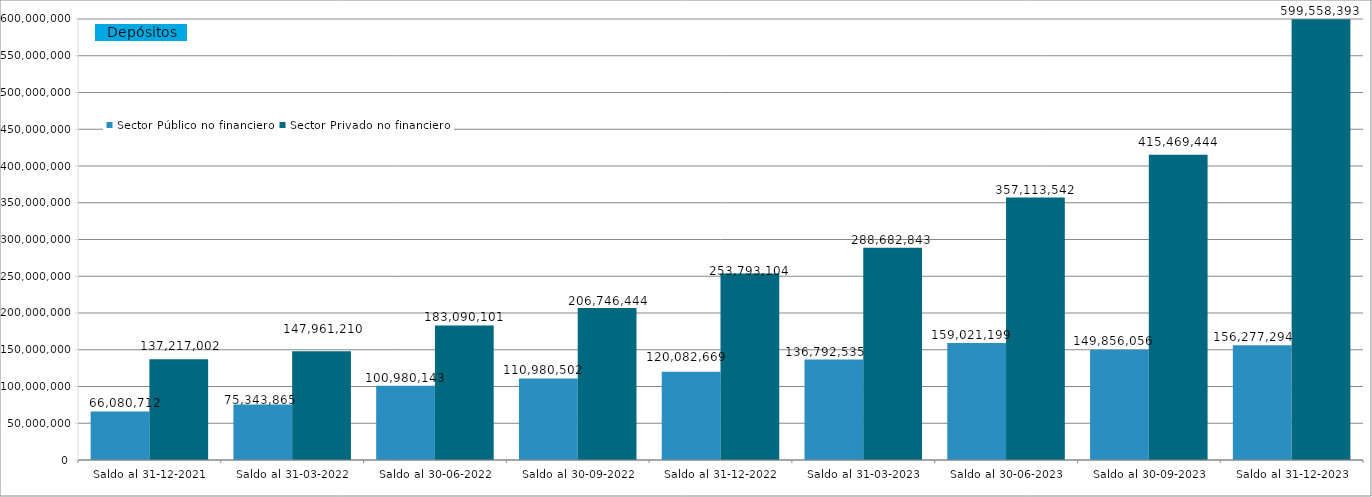
| Category | Sector Público no financiero | Sector Privado no financiero |
|---|---|---|
| Saldo al 31-12-2021 | 66080711.607 | 137217001.819 |
| Saldo al 31-03-2022 | 75343864.844 | 147961209.904 |
| Saldo al 30-06-2022 | 100980143.371 | 183090100.913 |
| Saldo al 30-09-2022 | 110980501.9 | 206746444.315 |
| Saldo al 31-12-2022 | 120082669.051 | 253793103.969 |
| Saldo al 31-03-2023 | 136792534.624 | 288682842.63 |
| Saldo al 30-06-2023 | 159021198.726 | 357113541.739 |
| Saldo al 30-09-2023 | 149856055.819 | 415469443.737 |
| Saldo al 31-12-2023 | 156277293.888 | 599558392.61 |